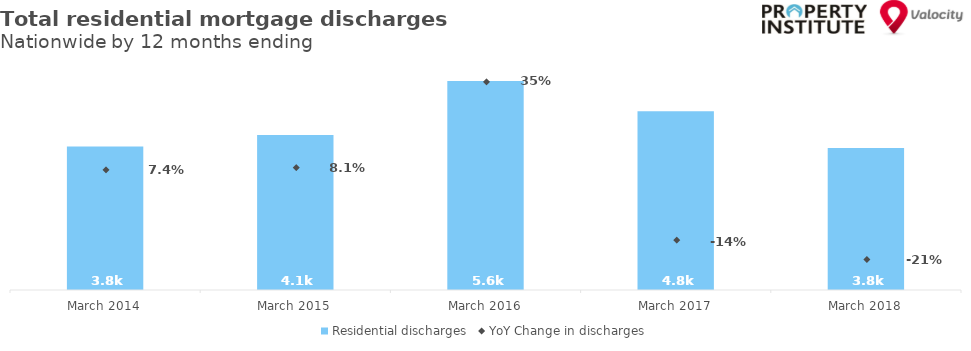
| Category | Residential discharges |
|---|---|
| 2014-03-01 | 3827 |
| 2015-03-01 | 4136 |
| 2016-03-01 | 5573 |
| 2017-03-01 | 4767 |
| 2018-03-01 | 3788 |